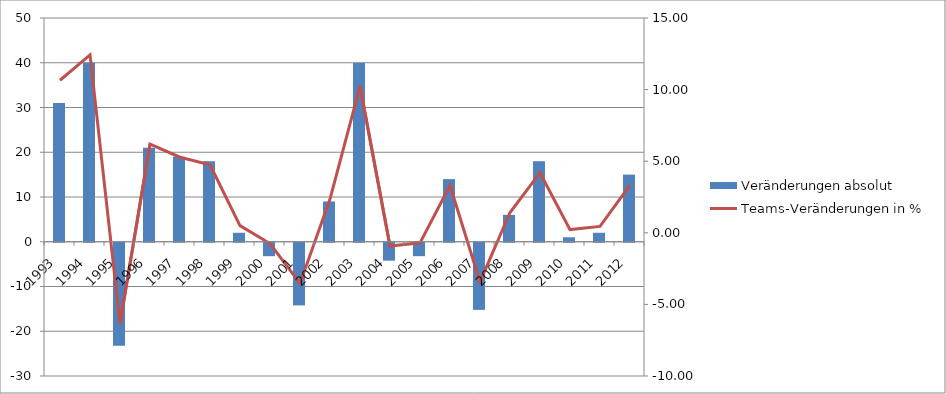
| Category | Veränderungen absolut |
|---|---|
| 1993.0 | 31 |
| 1994.0 | 40 |
| 1995.0 | -23 |
| 1996.0 | 21 |
| 1997.0 | 19 |
| 1998.0 | 18 |
| 1999.0 | 2 |
| 2000.0 | -3 |
| 2001.0 | -14 |
| 2002.0 | 9 |
| 2003.0 | 40 |
| 2004.0 | -4 |
| 2005.0 | -3 |
| 2006.0 | 14 |
| 2007.0 | -15 |
| 2008.0 | 6 |
| 2009.0 | 18 |
| 2010.0 | 1 |
| 2011.0 | 2 |
| 2012.0 | 15 |